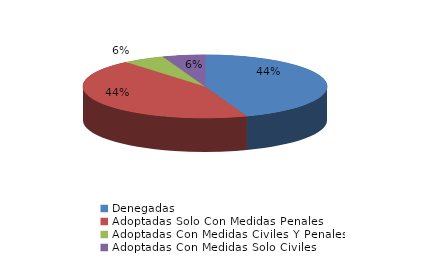
| Category | Series 0 |
|---|---|
| Denegadas | 8 |
| Adoptadas Solo Con Medidas Penales | 8 |
| Adoptadas Con Medidas Civiles Y Penales | 1 |
| Adoptadas Con Medidas Solo Civiles | 1 |